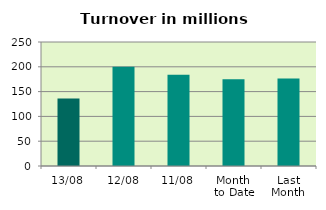
| Category | Series 0 |
|---|---|
| 13/08 | 136.094 |
| 12/08 | 199.934 |
| 11/08 | 184.144 |
| Month 
to Date | 174.785 |
| Last
Month | 176.477 |